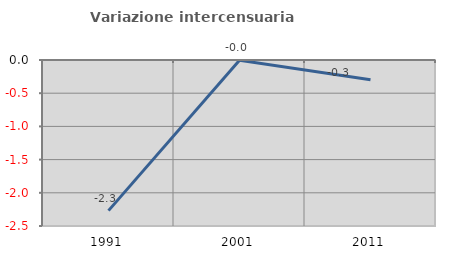
| Category | Variazione intercensuaria annua |
|---|---|
| 1991.0 | -2.269 |
| 2001.0 | -0.004 |
| 2011.0 | -0.297 |